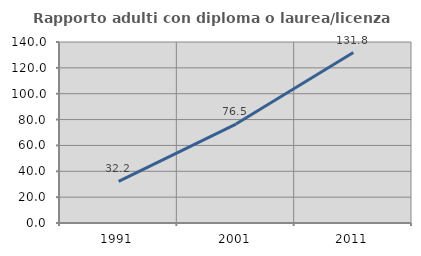
| Category | Rapporto adulti con diploma o laurea/licenza media  |
|---|---|
| 1991.0 | 32.245 |
| 2001.0 | 76.503 |
| 2011.0 | 131.844 |